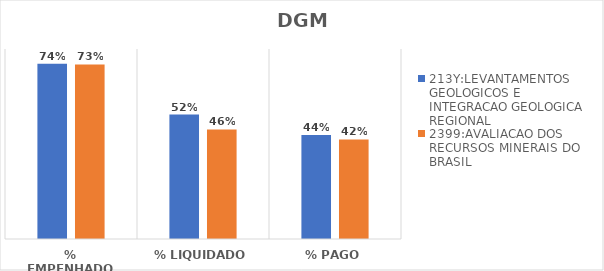
| Category | 213Y:LEVANTAMENTOS GEOLOGICOS E INTEGRACAO GEOLOGICA REGIONAL | 2399:AVALIACAO DOS RECURSOS MINERAIS DO BRASIL |
|---|---|---|
| % EMPENHADO | 0.738 | 0.735 |
| % LIQUIDADO | 0.524 | 0.461 |
| % PAGO | 0.438 | 0.419 |